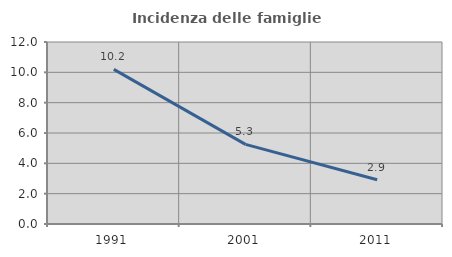
| Category | Incidenza delle famiglie numerose |
|---|---|
| 1991.0 | 10.195 |
| 2001.0 | 5.25 |
| 2011.0 | 2.919 |